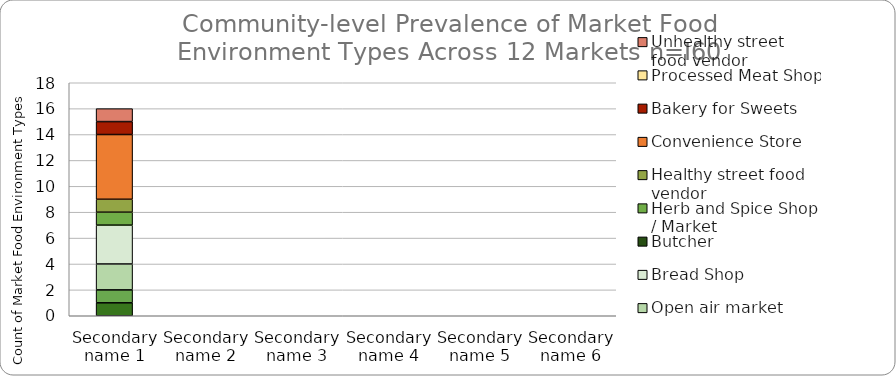
| Category | Supermarket / large grocery | Small grocery | Open air market | Bread Shop | Butcher | Herb and Spice Shop / Market | Healthy street food vendor | Convenience Store | Bakery for Sweets | Processed Meat Shop | Unhealthy street food vendor |
|---|---|---|---|---|---|---|---|---|---|---|---|
| Secondary name 1 | 1 | 1 | 2 | 3 | 0 | 1 | 1 | 5 | 1 | 0 | 1 |
| Secondary name 2 | 0 | 0 | 0 | 0 | 0 | 0 | 0 | 0 | 0 | 0 | 0 |
| Secondary name 3 | 0 | 0 | 0 | 0 | 0 | 0 | 0 | 0 | 0 | 0 | 0 |
| Secondary name 4 | 0 | 0 | 0 | 0 | 0 | 0 | 0 | 0 | 0 | 0 | 0 |
| Secondary name 5 | 0 | 0 | 0 | 0 | 0 | 0 | 0 | 0 | 0 | 0 | 0 |
| Secondary name 6 | 0 | 0 | 0 | 0 | 0 | 0 | 0 | 0 | 0 | 0 | 0 |